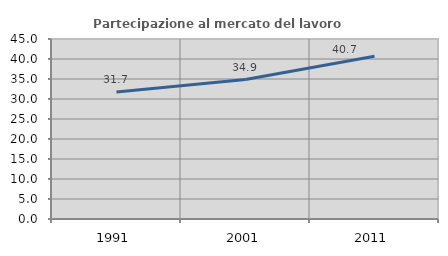
| Category | Partecipazione al mercato del lavoro  femminile |
|---|---|
| 1991.0 | 31.739 |
| 2001.0 | 34.867 |
| 2011.0 | 40.67 |